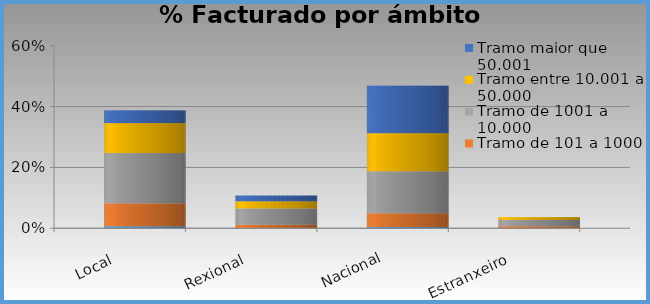
| Category | Tramo  de 0 a 100 € | Tramo de 101 a 1000 | Tramo de 1001 a 10.000 | Tramo entre 10.001 a 50.000 | Tramo maior que 50.001 |
|---|---|---|---|---|---|
| Local | 0.007 | 0.075 | 0.165 | 0.098 | 0.042 |
| Rexional | 0.001 | 0.011 | 0.054 | 0.023 | 0.019 |
| Nacional | 0.004 | 0.045 | 0.138 | 0.125 | 0.156 |
| Estranxeiro | 0 | 0.006 | 0.021 | 0.009 | 0 |